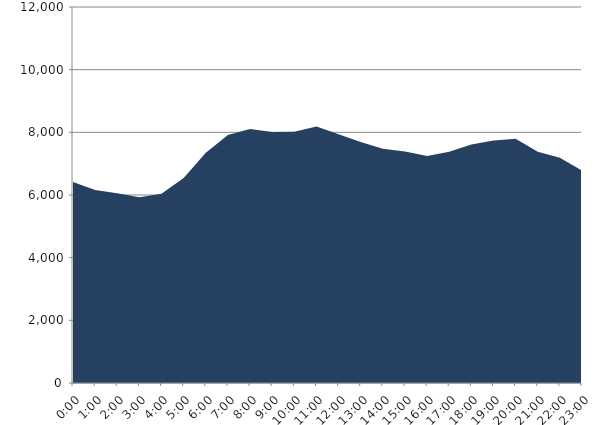
| Category | Series 0 | Series 1 |
|---|---|---|
| 2020-04-15 |  | 6417.731 |
| 2020-04-15 01:00:00 |  | 6159.064 |
| 2020-04-15 02:00:00 |  | 6052.243 |
| 2020-04-15 03:00:00 |  | 5928.94 |
| 2020-04-15 04:00:00 |  | 6042.364 |
| 2020-04-15 05:00:00 |  | 6540.502 |
| 2020-04-15 06:00:00 |  | 7351.838 |
| 2020-04-15 07:00:00 |  | 7918.115 |
| 2020-04-15 08:00:00 |  | 8103.009 |
| 2020-04-15 09:00:00 |  | 8007.714 |
| 2020-04-15 10:00:00 |  | 8014.972 |
| 2020-04-15 11:00:00 |  | 8184.72 |
| 2020-04-15 12:00:00 |  | 7935.973 |
| 2020-04-15 13:00:00 |  | 7689.179 |
| 2020-04-15 14:00:00 |  | 7479.037 |
| 2020-04-15 15:00:00 |  | 7386.679 |
| 2020-04-15 16:00:00 |  | 7248.25 |
| 2020-04-15 17:00:00 |  | 7378.094 |
| 2020-04-15 18:00:00 |  | 7615.203 |
| 2020-04-15 19:00:00 |  | 7741.743 |
| 2020-04-15 20:00:00 |  | 7793.24 |
| 2020-04-15 21:00:00 |  | 7379.579 |
| 2020-04-15 22:00:00 |  | 7192.018 |
| 2020-04-15 23:00:00 |  | 6777.518 |